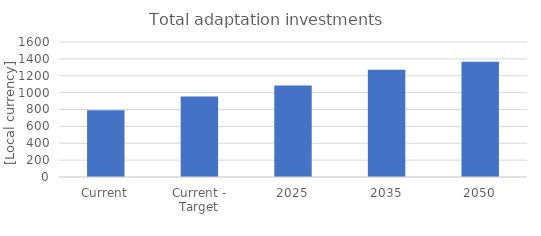
| Category | Total adaptation investments |
|---|---|
| Current | 790 |
| Current - Target | 955 |
| 2025 | 1085 |
| 2035 | 1270 |
| 2050 | 1365 |